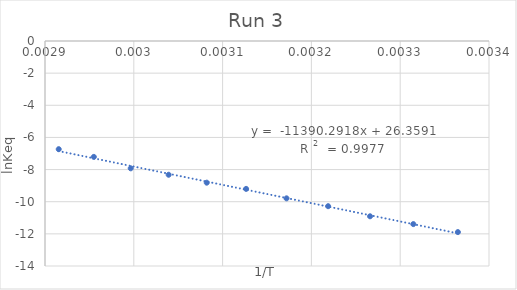
| Category | Series 0 |
|---|---|
| 0.003364963994885255 | -11.89 |
| 0.003314770617873243 | -11.393 |
| 0.0032660526487686982 | -10.907 |
| 0.0032188495831589788 | -10.279 |
| 0.003171985028230667 | -9.79 |
| 0.0031264655307175235 | -9.202 |
| 0.0030821390044691015 | -8.815 |
| 0.0030392365437802026 | -8.322 |
| 0.002996524032122737 | -7.922 |
| 0.002954995419757099 | -7.21 |
| 0.0029154518950437317 | -6.731 |